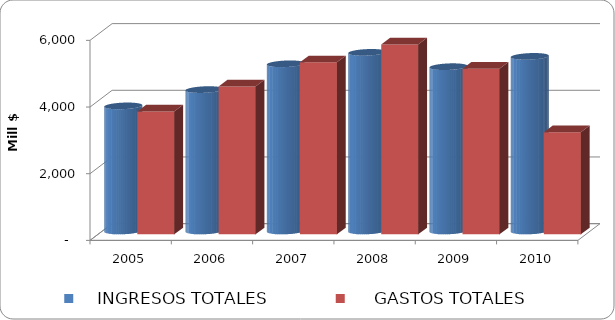
| Category |     INGRESOS TOTALES |      GASTOS TOTALES |
|---|---|---|
| 2005 | 3752.827 | 3684.776 |
| 2006 | 4241.866 | 4434.154 |
| 2007 | 5015.468 | 5158.599 |
| 2008 | 5358.347 | 5696.928 |
| 2009 | 4928.874 | 4965.146 |
| 2010 | 5237.905 | 3063.831 |